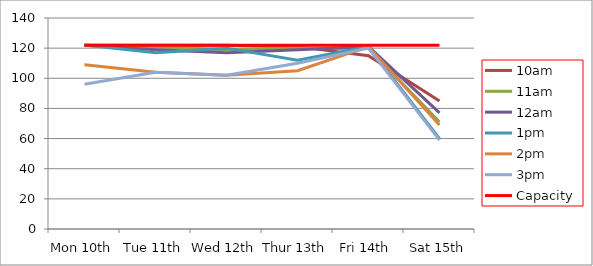
| Category | 9am | 10am | 11am | 12am | 1pm | 2pm | 3pm | 4pm | 5pm | Capacity |
|---|---|---|---|---|---|---|---|---|---|---|
| Mon 10th |  | 122 | 122 | 122 | 122 | 109 | 96 |  |  | 122 |
| Tue 11th |  | 122 | 121 | 119 | 117 | 104 | 104 |  |  | 122 |
| Wed 12th |  | 122 | 119 | 117 | 120 | 102 | 102 |  |  | 122 |
| Thur 13th |  | 121 | 120 | 119 | 112 | 105 | 110 |  |  | 122 |
| Fri 14th |  | 115 | 120 | 121 | 121 | 121 | 120 |  |  | 122 |
| Sat 15th |  | 85 | 71 | 77 | 60 | 69 | 59 |  |  | 122 |